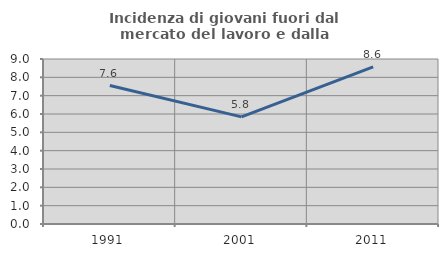
| Category | Incidenza di giovani fuori dal mercato del lavoro e dalla formazione  |
|---|---|
| 1991.0 | 7.553 |
| 2001.0 | 5.843 |
| 2011.0 | 8.565 |